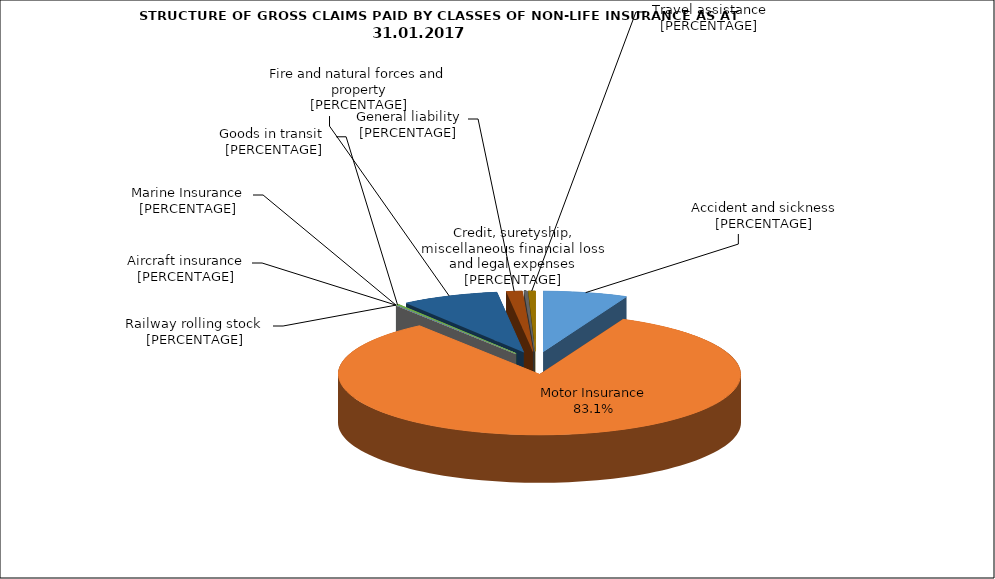
| Category | Злополука и заболяване |
|---|---|
| Злополука и заболяване | 0.068 |
| МПС | 0.831 |
| Релсови превозни средства | 0 |
| Летателни апарати | 0 |
| Плаванелни съдове | 0 |
| Товари по време на превоз | 0.002 |
| Пожар и природни бедствия и други щети на имущество | 0.078 |
| Обща гражданска отговорност | 0.013 |
| Кредити, гаранции, разни финансови загуби и правни разноски | 0.003 |
| Помощ при пътуване | 0.006 |